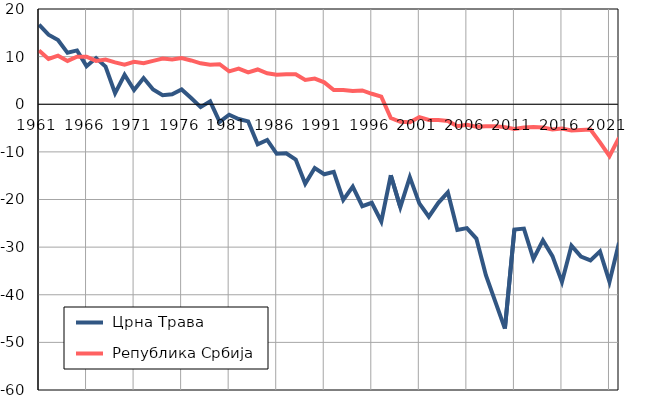
| Category |  Црна Трава |  Република Србија |
|---|---|---|
| 1961.0 | 16.7 | 11.3 |
| 1962.0 | 14.6 | 9.5 |
| 1963.0 | 13.5 | 10.2 |
| 1964.0 | 10.8 | 9.1 |
| 1965.0 | 11.3 | 10 |
| 1966.0 | 8 | 10 |
| 1967.0 | 9.7 | 9.1 |
| 1968.0 | 7.9 | 9.4 |
| 1969.0 | 2.3 | 8.8 |
| 1970.0 | 6.2 | 8.3 |
| 1971.0 | 3 | 8.9 |
| 1972.0 | 5.5 | 8.6 |
| 1973.0 | 3.1 | 9.1 |
| 1974.0 | 1.9 | 9.6 |
| 1975.0 | 2.1 | 9.4 |
| 1976.0 | 3.1 | 9.7 |
| 1977.0 | 1.3 | 9.2 |
| 1978.0 | -0.6 | 8.6 |
| 1979.0 | 0.6 | 8.3 |
| 1980.0 | -3.7 | 8.4 |
| 1981.0 | -2.2 | 6.9 |
| 1982.0 | -3.1 | 7.5 |
| 1983.0 | -3.6 | 6.7 |
| 1984.0 | -8.4 | 7.3 |
| 1985.0 | -7.5 | 6.5 |
| 1986.0 | -10.4 | 6.2 |
| 1987.0 | -10.3 | 6.3 |
| 1988.0 | -11.6 | 6.3 |
| 1989.0 | -16.7 | 5.1 |
| 1990.0 | -13.4 | 5.4 |
| 1991.0 | -14.7 | 4.6 |
| 1992.0 | -14.2 | 3 |
| 1993.0 | -20.1 | 3 |
| 1994.0 | -17.3 | 2.8 |
| 1995.0 | -21.4 | 2.9 |
| 1996.0 | -20.7 | 2.2 |
| 1997.0 | -24.6 | 1.6 |
| 1998.0 | -14.9 | -2.9 |
| 1999.0 | -21.6 | -3.7 |
| 2000.0 | -15.3 | -3.8 |
| 2001.0 | -20.8 | -2.7 |
| 2002.0 | -23.6 | -3.3 |
| 2003.0 | -20.7 | -3.3 |
| 2004.0 | -18.5 | -3.5 |
| 2005.0 | -26.4 | -4.6 |
| 2006.0 | -26 | -4.3 |
| 2007.0 | -28.2 | -4.7 |
| 2008.0 | -35.9 | -4.6 |
| 2009.0 | -41.5 | -4.6 |
| 2010.0 | -47.1 | -4.8 |
| 2011.0 | -26.3 | -5.2 |
| 2012.0 | -26.1 | -4.9 |
| 2013.0 | -32.5 | -4.8 |
| 2014.0 | -28.6 | -4.9 |
| 2015.0 | -31.9 | -5.3 |
| 2016.0 | -37.3 | -5.1 |
| 2017.0 | -29.7 | -5.5 |
| 2018.0 | -32 | -5.4 |
| 2019.0 | -32.8 | -5.3 |
| 2020.0 | -30.9 | -8 |
| 2021.0 | -37.3 | -10.9 |
| 2022.0 | -29.1 | -7 |